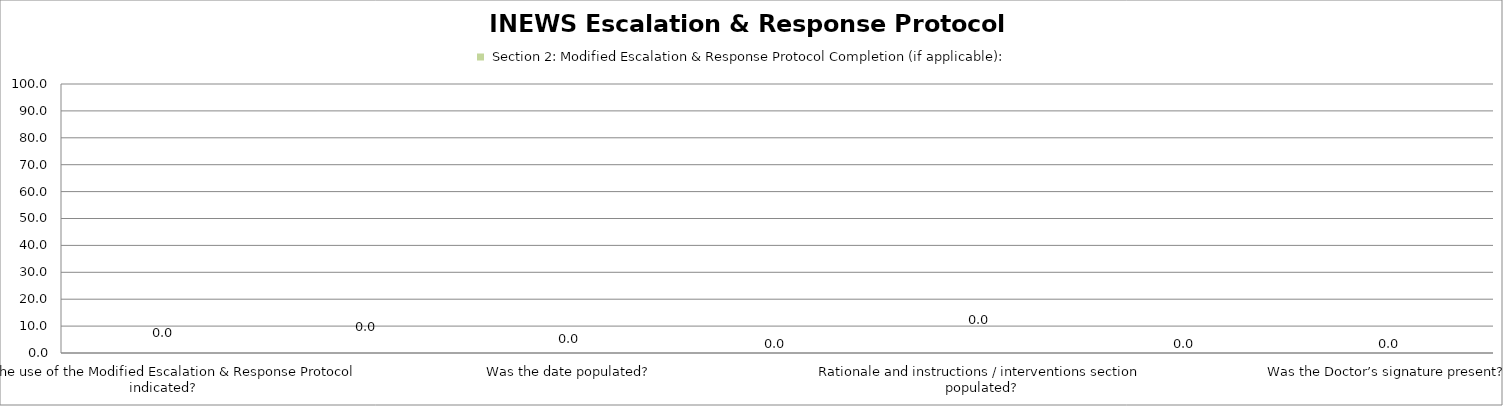
| Category |  Section 2: Modified Escalation & Response Protocol Completion (if applicable):  |
|---|---|
| Was the use of the Modified Escalation & Response Protocol indicated? | 0 |
| If used was it completed by a senior clinician
(i.e Consultant or Registrar )? | 0 |
| Was the date populated? | 0 |
| Was the time populated? | 0 |
| Rationale and instructions / interventions section populated? | 0 |
| Was the next medical review section populated? | 0 |
| Was the Doctor’s signature present? | 0 |